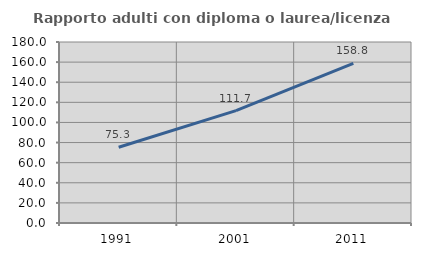
| Category | Rapporto adulti con diploma o laurea/licenza media  |
|---|---|
| 1991.0 | 75.301 |
| 2001.0 | 111.702 |
| 2011.0 | 158.824 |